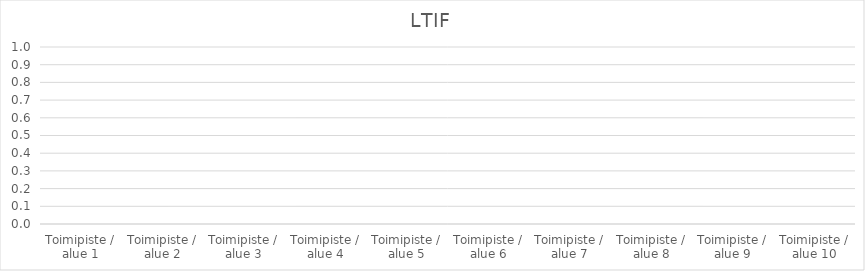
| Category | LTIF |
|---|---|
| Toimipiste / alue 1 | 0 |
| Toimipiste / alue 2 | 0 |
| Toimipiste / alue 3 | 0 |
| Toimipiste / alue 4 | 0 |
| Toimipiste / alue 5 | 0 |
| Toimipiste / alue 6 | 0 |
| Toimipiste / alue 7 | 0 |
| Toimipiste / alue 8 | 0 |
| Toimipiste / alue 9 | 0 |
| Toimipiste / alue 10 | 0 |